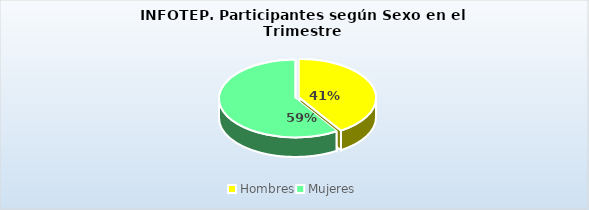
| Category | Series 0 |
|---|---|
| Hombres | 83760 |
| Mujeres | 120970 |